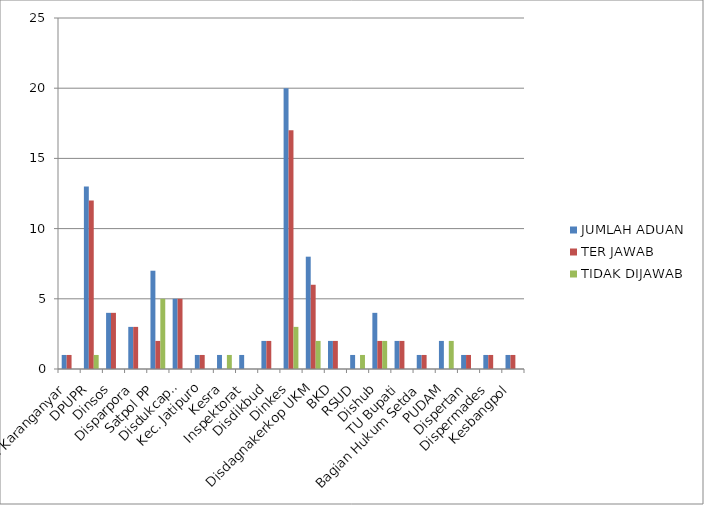
| Category | JUMLAH ADUAN | TER JAWAB | TIDAK DIJAWAB |
|---|---|---|---|
| Kel. Karanganyar | 1 | 1 | 0 |
| DPUPR | 13 | 12 | 1 |
| Dinsos | 4 | 4 | 0 |
| Disparpora | 3 | 3 | 0 |
| Satpol PP | 7 | 2 | 5 |
| Disdukcapil | 5 | 5 | 0 |
| Kec. Jatipuro | 1 | 1 | 0 |
| Kesra | 1 | 0 | 1 |
| Inspektorat | 1 | 0 | 0 |
| Disdikbud | 2 | 2 | 0 |
| Dinkes | 20 | 17 | 3 |
| Disdagnakerkop UKM | 8 | 6 | 2 |
| BKD | 2 | 2 | 0 |
| RSUD | 1 | 0 | 1 |
| Dishub | 4 | 2 | 2 |
| TU Bupati | 2 | 2 | 0 |
| Bagian Hukum Setda | 1 | 1 | 0 |
| PUDAM | 2 | 0 | 2 |
| Dispertan | 1 | 1 | 0 |
| Dispermades | 1 | 1 | 0 |
| Kesbangpol | 1 | 1 | 0 |